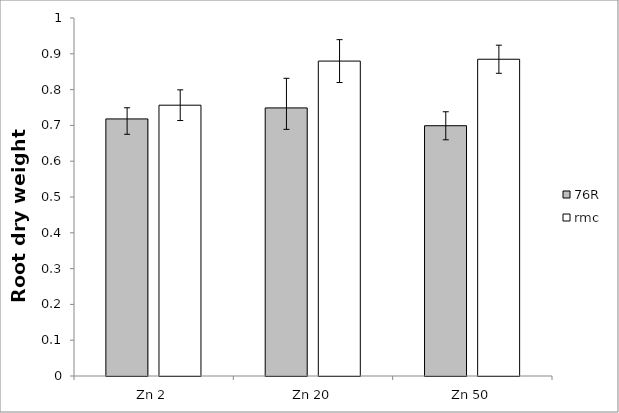
| Category | 76R | rmc |
|---|---|---|
| Zn 2 | 0.718 | 0.756 |
| Zn 20 | 0.749 | 0.88 |
| Zn 50 | 0.699 | 0.885 |